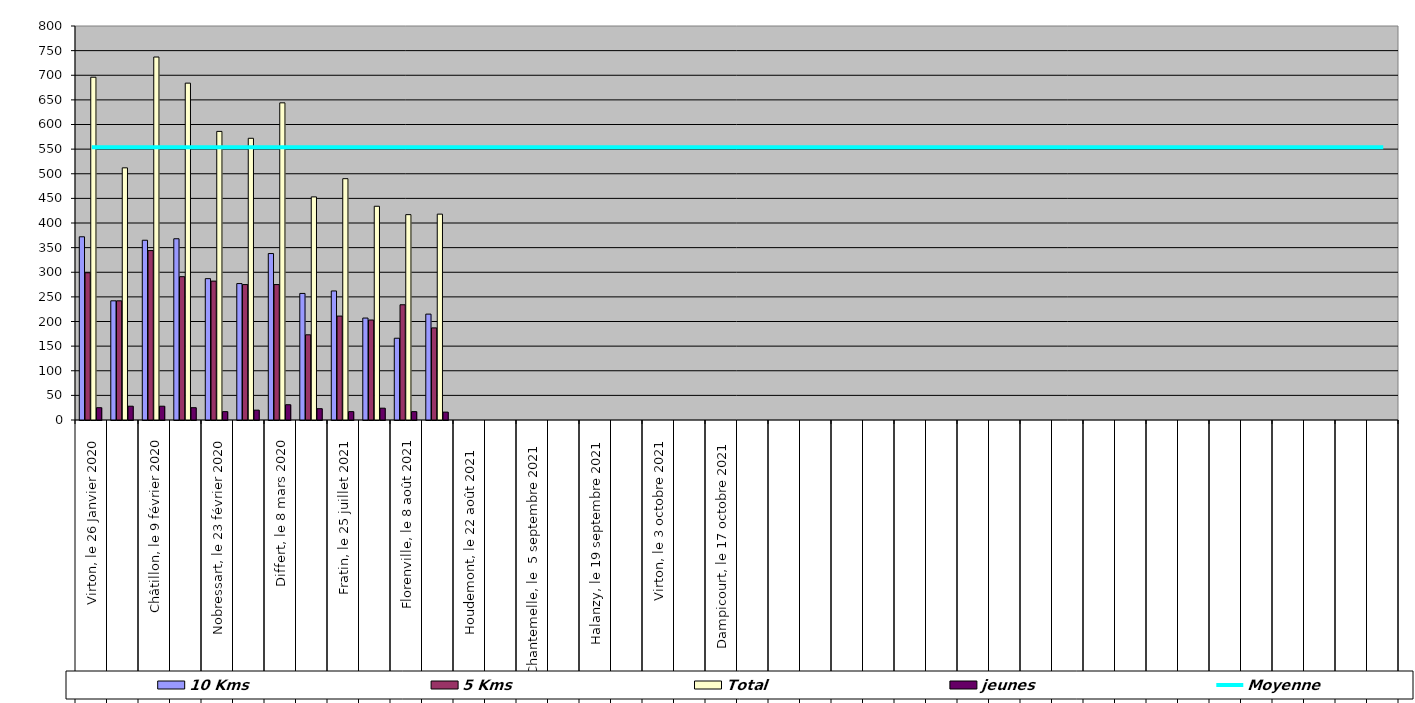
| Category | 10 Kms | 5 Kms | Total | jeunes |
|---|---|---|---|---|
| 0 | 372 | 299 | 696 | 25 |
| 1 | 242 | 242 | 512 | 28 |
| 2 | 365 | 344 | 737 | 28 |
| 3 | 368 | 291 | 684 | 25 |
| 4 | 287 | 282 | 586 | 17 |
| 5 | 277 | 275 | 572 | 20 |
| 6 | 338 | 275 | 644 | 31 |
| 7 | 257 | 173 | 453 | 23 |
| 8 | 262 | 211 | 490 | 17 |
| 9 | 207 | 203 | 434 | 24 |
| 10 | 166 | 234 | 417 | 17 |
| 11 | 215 | 187 | 418 | 16 |
| 12 | 0 | 0 | 0 | 0 |
| 13 | 0 | 0 | 0 | 0 |
| 14 | 0 | 0 | 0 | 0 |
| 15 | 0 | 0 | 0 | 0 |
| 16 | 0 | 0 | 0 | 0 |
| 17 | 0 | 0 | 0 | 0 |
| 18 | 0 | 0 | 0 | 0 |
| 19 | 0 | 0 | 0 | 0 |
| 20 | 0 | 0 | 0 | 0 |
| 21 | 0 | 0 | 0 | 0 |
| 22 | 0 | 0 | 0 | 0 |
| 23 | 0 | 0 | 0 | 0 |
| 24 | 0 | 0 | 0 | 0 |
| 25 | 0 | 0 | 0 | 0 |
| 26 | 0 | 0 | 0 | 0 |
| 27 | 0 | 0 | 0 | 0 |
| 28 | 0 | 0 | 0 | 0 |
| 29 | 0 | 0 | 0 | 0 |
| 30 | 0 | 0 | 0 | 0 |
| 31 | 0 | 0 | 0 | 0 |
| 32 | 0 | 0 | 0 | 0 |
| 33 | 0 | 0 | 0 | 0 |
| 34 | 0 | 0 | 0 | 0 |
| 35 | 0 | 0 | 0 | 0 |
| 36 | 0 | 0 | 0 | 0 |
| 37 | 0 | 0 | 0 | 0 |
| 38 | 0 | 0 | 0 | 0 |
| 39 | 0 | 0 | 0 | 0 |
| 40 | 0 | 0 | 0 | 0 |
| 41 | 0 | 0 | 0 | 0 |